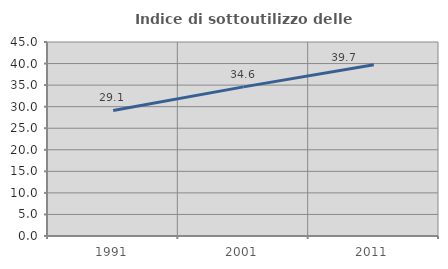
| Category | Indice di sottoutilizzo delle abitazioni  |
|---|---|
| 1991.0 | 29.134 |
| 2001.0 | 34.586 |
| 2011.0 | 39.706 |